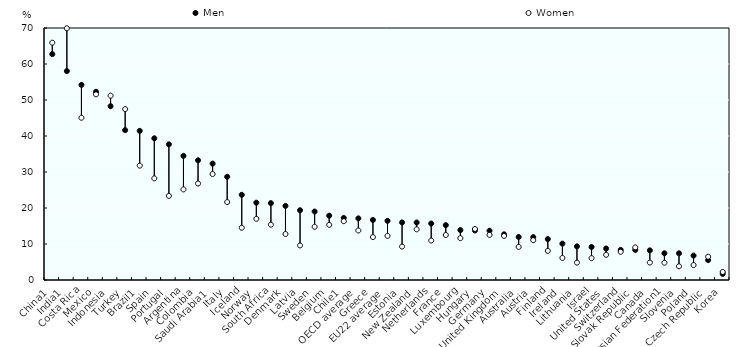
| Category | Men | Women |
|---|---|---|
| China1 | 62.736 | 65.913 |
| India1 | 58.037 | 69.914 |
| Costa Rica | 54.206 | 45.069 |
| Mexico | 52.27 | 51.571 |
| Indonesia | 48.274 | 51.211 |
| Turkey | 41.631 | 47.472 |
| Brazil1 | 41.429 | 31.77 |
| Spain | 39.364 | 28.234 |
| Portugal | 37.685 | 23.365 |
| Argentina | 34.49 | 25.169 |
| Colombia | 33.256 | 26.809 |
| Saudi Arabia1 | 32.333 | 29.44 |
| Italy | 28.677 | 21.647 |
| Iceland | 23.662 | 14.505 |
| Norway | 21.483 | 16.989 |
| South Africa | 21.355 | 15.367 |
| Denmark | 20.589 | 12.777 |
| Latvia | 19.38 | 9.598 |
| Sweden | 19.018 | 14.788 |
| Belgium | 17.862 | 15.315 |
| Chile1 | 17.239 | 16.335 |
| OECD average | 17.119 | 13.759 |
| Greece | 16.675 | 11.922 |
| EU22 average | 16.438 | 12.259 |
| Estonia | 15.993 | 9.284 |
| New Zealand | 15.973 | 14.072 |
| Netherlands | 15.69 | 10.958 |
| France | 15.24 | 12.505 |
| Luxembourg | 13.868 | 11.62 |
| Hungary | 13.757 | 14.17 |
| Germany | 13.688 | 12.525 |
| United Kingdom | 12.69 | 12.251 |
| Australia | 11.958 | 9.198 |
| Austria | 11.908 | 11.065 |
| Finland | 11.364 | 8.084 |
| Ireland | 10.104 | 6.128 |
| Lithuania | 9.348 | 4.826 |
| Israel | 9.17 | 6.057 |
| United States | 8.744 | 6.995 |
| Switzerland | 8.36 | 7.824 |
| Slovak Republic | 8.354 | 9.06 |
| Canada | 8.236 | 4.846 |
| Russian Federation1 | 7.428 | 4.8 |
| Slovenia | 7.42 | 3.81 |
| Poland | 6.779 | 4.141 |
| Czech Republic | 5.524 | 6.46 |
| Korea | 1.692 | 2.235 |